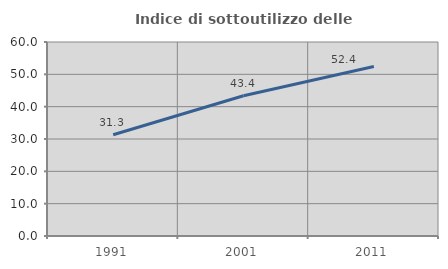
| Category | Indice di sottoutilizzo delle abitazioni  |
|---|---|
| 1991.0 | 31.325 |
| 2001.0 | 43.368 |
| 2011.0 | 52.424 |